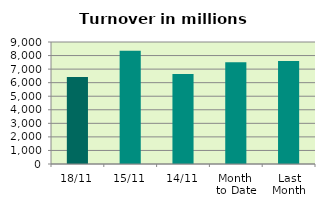
| Category | Series 0 |
|---|---|
| 18/11 | 6420.447 |
| 15/11 | 8350.704 |
| 14/11 | 6643.19 |
| Month 
to Date | 7504.753 |
| Last
Month | 7601.18 |